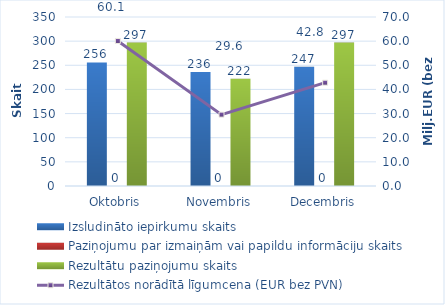
| Category | Izsludināto iepirkumu skaits | Paziņojumu par izmaiņām vai papildu informāciju skaits | Rezultātu paziņojumu skaits |
|---|---|---|---|
| Oktobris | 256 | 0 | 297 |
| Novembris | 236 | 0 | 222 |
| Decembris | 247 | 0 | 297 |